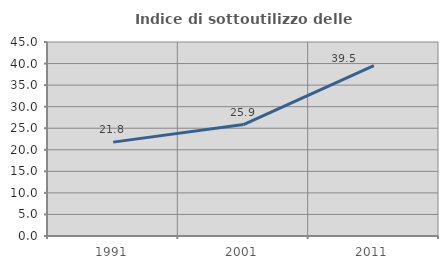
| Category | Indice di sottoutilizzo delle abitazioni  |
|---|---|
| 1991.0 | 21.776 |
| 2001.0 | 25.857 |
| 2011.0 | 39.535 |